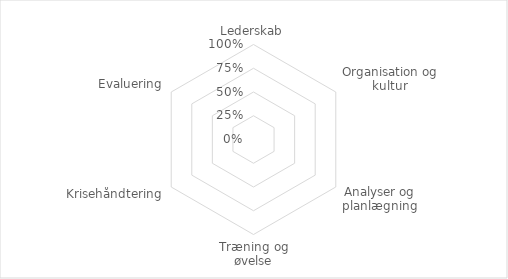
| Category | Series 0 |
|---|---|
| Lederskab | 0 |
| Organisation og kultur | 0 |
| Analyser og planlægning | 0 |
| Træning og øvelse | 0 |
| Krisehåndtering | 0 |
| Evaluering | 0 |